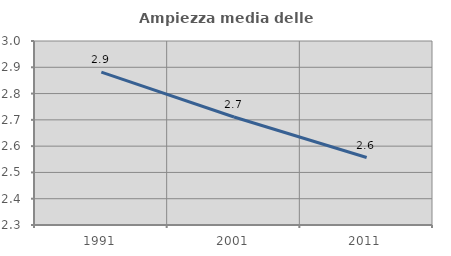
| Category | Ampiezza media delle famiglie |
|---|---|
| 1991.0 | 2.882 |
| 2001.0 | 2.711 |
| 2011.0 | 2.557 |